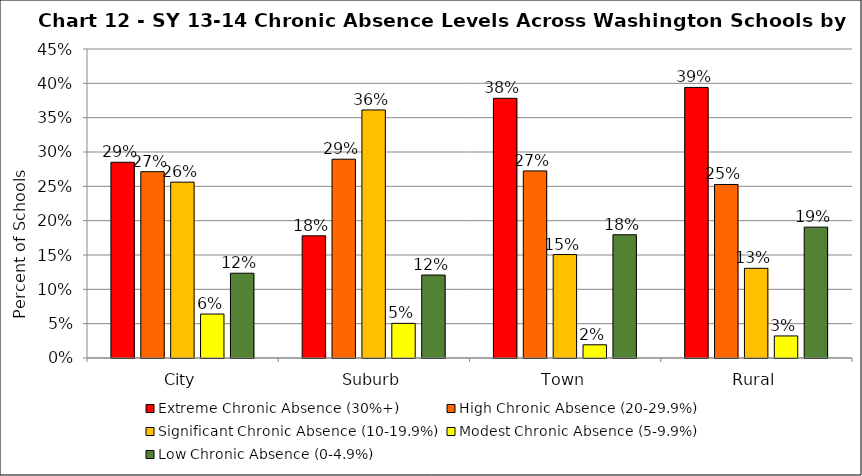
| Category | Extreme Chronic Absence (30%+) | High Chronic Absence (20-29.9%) | Significant Chronic Absence (10-19.9%) | Modest Chronic Absence (5-9.9%) | Low Chronic Absence (0-4.9%) |
|---|---|---|---|---|---|
| 0 | 0.285 | 0.271 | 0.256 | 0.064 | 0.123 |
| 1 | 0.178 | 0.29 | 0.361 | 0.05 | 0.121 |
| 2 | 0.378 | 0.272 | 0.151 | 0.019 | 0.179 |
| 3 | 0.394 | 0.253 | 0.131 | 0.032 | 0.191 |